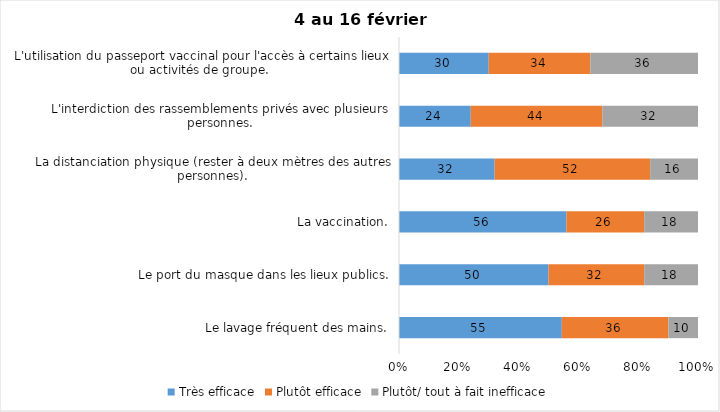
| Category | Très efficace | Plutôt efficace | Plutôt/ tout à fait inefficace |
|---|---|---|---|
| Le lavage fréquent des mains. | 55 | 36 | 10 |
| Le port du masque dans les lieux publics. | 50 | 32 | 18 |
| La vaccination. | 56 | 26 | 18 |
| La distanciation physique (rester à deux mètres des autres personnes). | 32 | 52 | 16 |
| L'interdiction des rassemblements privés avec plusieurs personnes. | 24 | 44 | 32 |
| L'utilisation du passeport vaccinal pour l'accès à certains lieux ou activités de groupe.  | 30 | 34 | 36 |